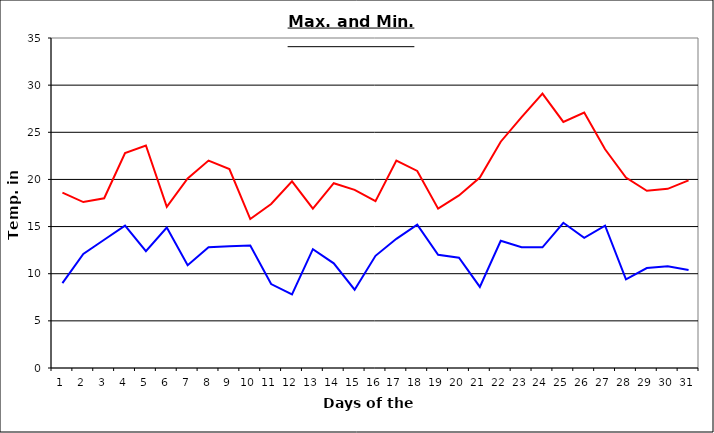
| Category | Series 0 | Series 1 |
|---|---|---|
| 0 | 18.6 | 9 |
| 1 | 17.6 | 12.1 |
| 2 | 18 | 13.6 |
| 3 | 22.8 | 15.1 |
| 4 | 23.6 | 12.4 |
| 5 | 17.1 | 14.9 |
| 6 | 20.1 | 10.9 |
| 7 | 22 | 12.8 |
| 8 | 21.1 | 12.9 |
| 9 | 15.8 | 13 |
| 10 | 17.4 | 8.9 |
| 11 | 19.8 | 7.8 |
| 12 | 16.9 | 12.6 |
| 13 | 19.6 | 11.1 |
| 14 | 18.9 | 8.3 |
| 15 | 17.7 | 11.9 |
| 16 | 22 | 13.7 |
| 17 | 20.9 | 15.2 |
| 18 | 16.9 | 12 |
| 19 | 18.3 | 11.7 |
| 20 | 20.2 | 8.6 |
| 21 | 24 | 13.5 |
| 22 | 26.6 | 12.8 |
| 23 | 29.1 | 12.8 |
| 24 | 26.1 | 15.4 |
| 25 | 27.1 | 13.8 |
| 26 | 23.2 | 15.1 |
| 27 | 20.2 | 9.4 |
| 28 | 18.8 | 10.6 |
| 29 | 19 | 10.8 |
| 30 | 19.9 | 10.4 |